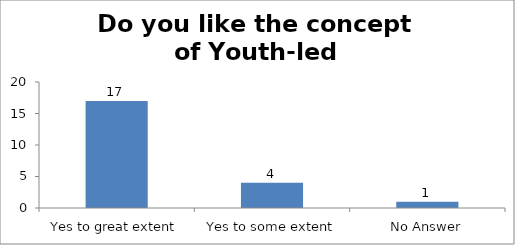
| Category | Do you like the concept of Youth-led Changemaking?  |
|---|---|
| Yes to great extent | 17 |
| Yes to some extent | 4 |
| No Answer | 1 |